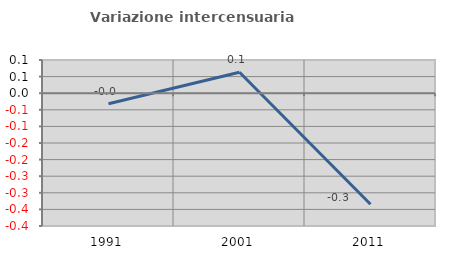
| Category | Variazione intercensuaria annua |
|---|---|
| 1991.0 | -0.032 |
| 2001.0 | 0.063 |
| 2011.0 | -0.335 |